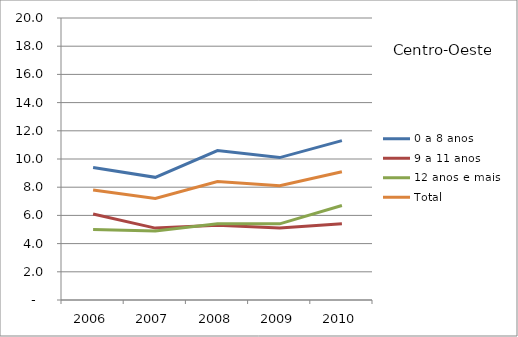
| Category | 0 a 8 anos | 9 a 11 anos | 12 anos e mais | Total |
|---|---|---|---|---|
| 2006.0 | 9.4 | 6.1 | 5 | 7.8 |
| 2007.0 | 8.7 | 5.1 | 4.9 | 7.2 |
| 2008.0 | 10.6 | 5.3 | 5.4 | 8.4 |
| 2009.0 | 10.1 | 5.1 | 5.4 | 8.1 |
| 2010.0 | 11.3 | 5.4 | 6.7 | 9.1 |